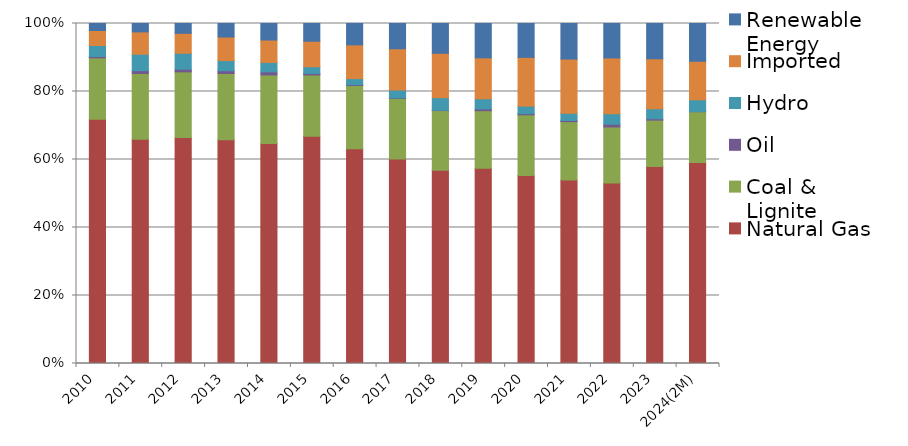
| Category | Natural Gas | Coal & Lignite | Oil | Hydro | Imported | Renewable Energy |
|---|---|---|---|---|---|---|
| 2010 | 71.855 | 18.058 | 0.376 | 3.244 | 4.401 | 2.067 |
| 2011 | 65.977 | 19.326 | 0.824 | 4.836 | 6.566 | 2.472 |
| 2012 | 66.507 | 19.268 | 0.776 | 4.697 | 5.865 | 2.887 |
| 2013 | 65.792 | 19.509 | 0.798 | 2.987 | 6.938 | 3.977 |
| 2014 | 64.677 | 20.197 | 0.897 | 2.776 | 6.59 | 4.863 |
| 2015 | 66.854 | 17.988 | 0.48 | 1.956 | 7.498 | 5.223 |
| 2016 | 63.184 | 18.586 | 0.246 | 1.775 | 9.93 | 6.279 |
| 2017 | 60.171 | 17.763 | 0.164 | 2.33 | 12.143 | 7.429 |
| 2018 | 56.873 | 17.511 | 0.087 | 3.716 | 13.046 | 8.767 |
| 2019 | 57.457 | 16.894 | 0.53 | 2.976 | 12.047 | 10.096 |
| 2020 | 55.265 | 17.873 | 0.35 | 2.204 | 14.343 | 9.964 |
| 2021 | 53.936 | 17.197 | 0.342 | 2.165 | 15.905 | 10.455 |
| 2022 | 53.112 | 16.458 | 0.802 | 3.057 | 16.434 | 10.135 |
| 2023 | 57.954 | 13.63 | 0.398 | 2.951 | 14.692 | 10.376 |
| 2024(2M) | 59.102 | 14.958 | 0.029 | 3.453 | 11.358 | 11.1 |